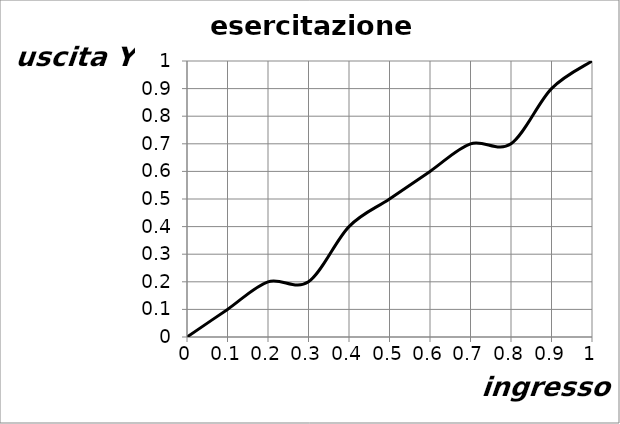
| Category | Series 0 |
|---|---|
| 0.0 | 0 |
| 0.1 | 0.1 |
| 0.2 | 0.2 |
| 0.30000000000000004 | 0.2 |
| 0.4 | 0.4 |
| 0.5 | 0.5 |
| 0.6 | 0.6 |
| 0.7 | 0.7 |
| 0.7999999999999999 | 0.7 |
| 0.8999999999999999 | 0.9 |
| 0.9999999999999999 | 1 |